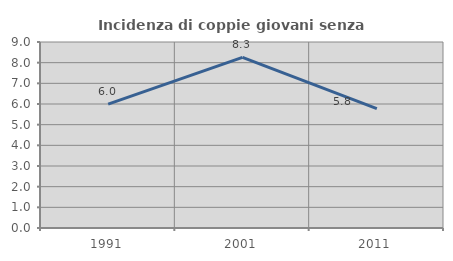
| Category | Incidenza di coppie giovani senza figli |
|---|---|
| 1991.0 | 5.998 |
| 2001.0 | 8.255 |
| 2011.0 | 5.774 |